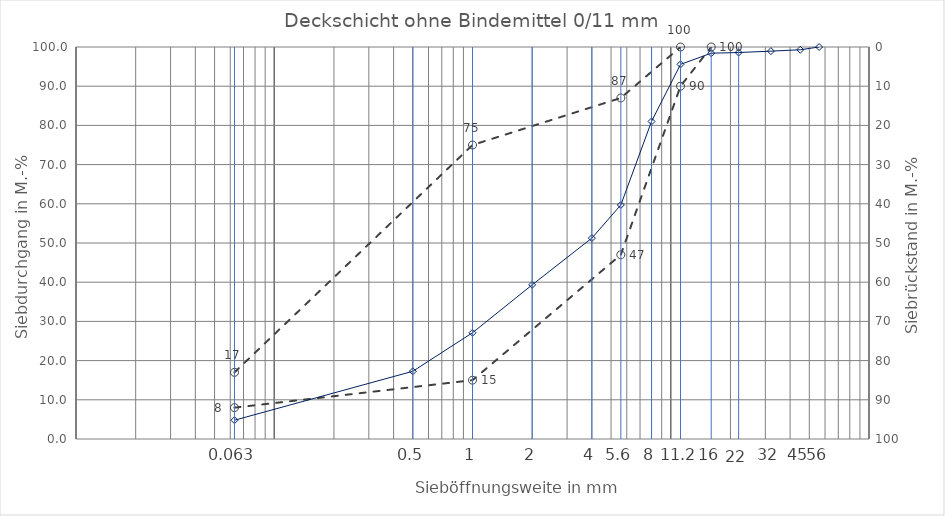
| Category | Series 10 |
|---|---|
| 0.0 | 0 |
| 0.063 | 0 |
| 0.5 | 0 |
| 1.0 | 0 |
| 2.0 | 0 |
| 4.0 | 0 |
| 5.6 | 0 |
| 8.0 | 0 |
| 11.2 | 0 |
| 16.0 | 0 |
| 22.0 | 0 |
| 32.0 | 0 |
| 45.0 | 0 |
| 56.0 | 0 |